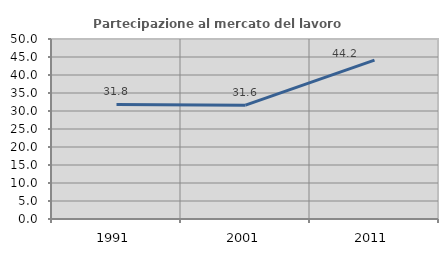
| Category | Partecipazione al mercato del lavoro  femminile |
|---|---|
| 1991.0 | 31.84 |
| 2001.0 | 31.616 |
| 2011.0 | 44.15 |